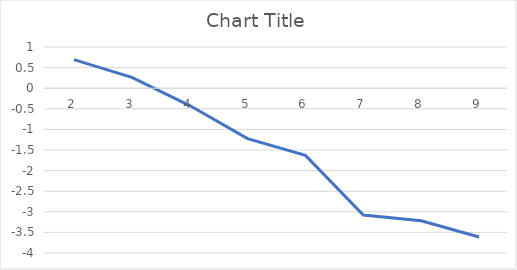
| Category | Series 0 |
|---|---|
| 2 | 0.693 |
| 3 | 0.261 |
| 4 | -0.421 |
| 5 | -1.224 |
| 6 | -1.63 |
| 7 | -3.08 |
| 8 | -3.219 |
| 9 | -3.611 |